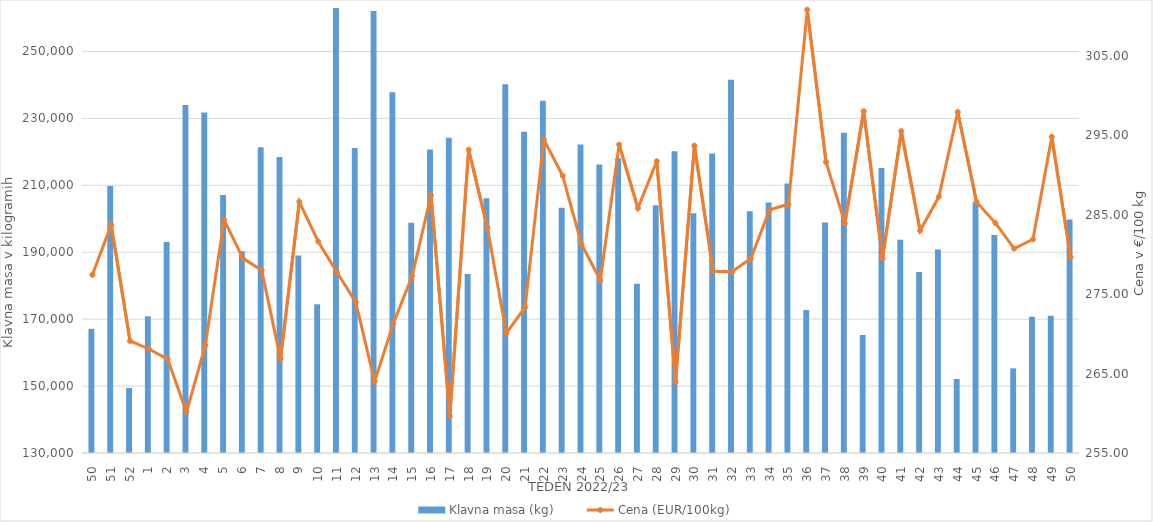
| Category | Klavna masa (kg) |
|---|---|
| 50.0 | 167119 |
| 51.0 | 209797 |
| 52.0 | 149439 |
| 1.0 | 170843 |
| 2.0 | 193093 |
| 3.0 | 234042 |
| 4.0 | 231737 |
| 5.0 | 207136 |
| 6.0 | 190311 |
| 7.0 | 221366 |
| 8.0 | 218470 |
| 9.0 | 189006 |
| 10.0 | 174425 |
| 11.0 | 265476 |
| 12.0 | 221171 |
| 13.0 | 262102 |
| 14.0 | 237813 |
| 15.0 | 198828 |
| 16.0 | 220686 |
| 17.0 | 224192 |
| 18.0 | 183508 |
| 19.0 | 206133 |
| 20.0 | 240223 |
| 21.0 | 226050 |
| 22.0 | 235273 |
| 23.0 | 203306 |
| 24.0 | 222178 |
| 25.0 | 216259 |
| 26.0 | 218064 |
| 27.0 | 180556 |
| 28.0 | 204078 |
| 29.0 | 220162 |
| 30.0 | 201649 |
| 31.0 | 219538 |
| 32.0 | 241549 |
| 33.0 | 202261 |
| 34.0 | 204903 |
| 35.0 | 210575 |
| 36.0 | 172745 |
| 37.0 | 198877 |
| 38.0 | 225730 |
| 39.0 | 165273 |
| 40.0 | 215175 |
| 41.0 | 193769 |
| 42.0 | 184122 |
| 43.0 | 190834 |
| 44.0 | 152119 |
| 45.0 | 204974 |
| 46.0 | 195179 |
| 47.0 | 155300 |
| 48.0 | 170687 |
| 49.0 | 171040 |
| 50.0 | 199802 |